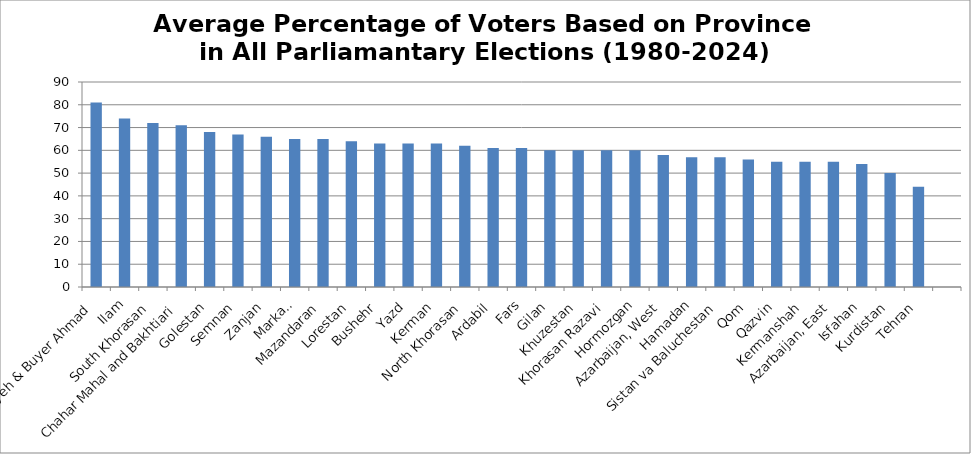
| Category | Average |
|---|---|
| Kohgiluyeh & Buyer Ahmad | 81 |
| Ilam | 74 |
| South Khorasan | 72 |
| Chahar Mahal and Bakhtiari | 71 |
| Golestan | 68 |
| Semnan | 67 |
| Zanjan | 66 |
| Markazi | 65 |
| Mazandaran | 65 |
| Lorestan | 64 |
| Bushehr | 63 |
| Yazd | 63 |
| Kerman | 63 |
| North Khorasan | 62 |
| Ardabil | 61 |
| Fars | 61 |
| Gilan | 60 |
| Khuzestan | 60 |
| Khorasan Razavi | 60 |
| Hormozgan | 60 |
| Azarbaijan, West | 58 |
| Hamadan | 57 |
| Sistan va Baluchestan | 57 |
| Qom | 56 |
| Qazvin | 55 |
| Kermanshah | 55 |
| Azarbaijan, East | 55 |
| Isfahan | 54 |
| Kurdistan | 50 |
| Tehran | 44 |